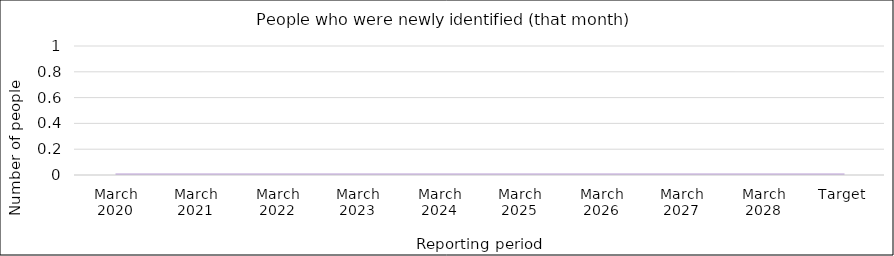
| Category | Series 0 |
|---|---|
| March 2020 | 0 |
| March 2021 | 0 |
| March 2022 | 0 |
| March 2023 | 0 |
| March 2024 | 0 |
| March 2025 | 0 |
| March 2026 | 0 |
| March 2027 | 0 |
| March 2028 | 0 |
| Target | 0 |